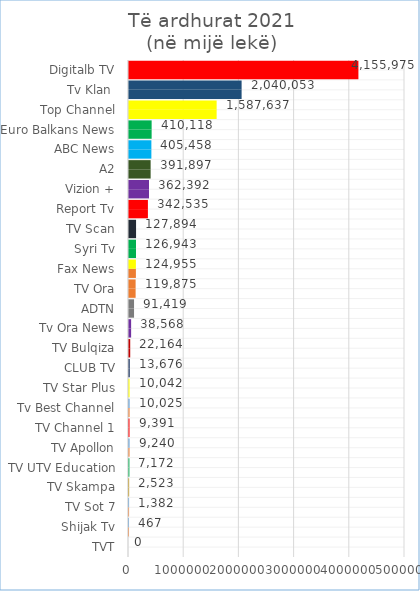
| Category | Series 1 | Series 0 |
|---|---|---|
| TVT | 0 | 0 |
| Shijak Tv | 466.798 | 466.798 |
| TV Sot 7 | 1382.389 | 1382.389 |
| TV Skampa | 2522.651 | 2522.651 |
| TV UTV Education | 7171.65 | 7171.65 |
| TV Apollon | 9240.29 | 9240.29 |
| TV Channel 1 | 9391.42 | 9391.42 |
| Tv Best Channel | 10024.535 | 10024.535 |
| TV Star Plus | 10041.539 | 10041.539 |
| CLUB TV | 13675.974 | 13675.974 |
| TV Bulqiza | 22164.219 | 22164.219 |
| Tv Ora News | 38568.496 | 38568.496 |
| ADTN | 91419.379 | 91419.379 |
| TV Ora | 119875.247 | 119875.247 |
| Fax News | 124955.157 | 124955.157 |
| Syri Tv | 126942.949 | 126942.949 |
| TV Scan | 127894.225 | 127894.225 |
| Report Tv | 342535.448 | 342535.448 |
| Vizion + | 362391.963 | 362391.963 |
| A2 | 391897.292 | 391897.292 |
| ABC News | 405458.353 | 405458.353 |
| Euro Balkans News | 410117.969 | 410117.969 |
| Top Channel | 1587636.659 | 1587636.659 |
| Tv Klan  | 2040053.474 | 2040053.474 |
| Digitalb TV | 4155974.797 | 4155974.797 |